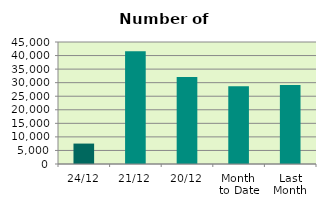
| Category | Series 0 |
|---|---|
| 24/12 | 7534 |
| 21/12 | 41580 |
| 20/12 | 32084 |
| Month 
to Date | 28675.625 |
| Last
Month | 29125.182 |